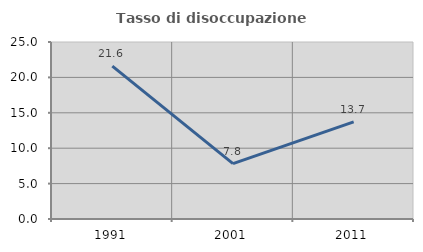
| Category | Tasso di disoccupazione giovanile  |
|---|---|
| 1991.0 | 21.591 |
| 2001.0 | 7.812 |
| 2011.0 | 13.725 |